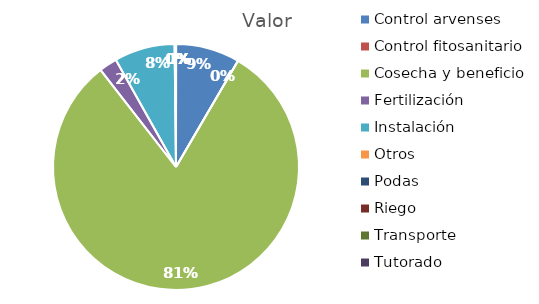
| Category | Valor |
|---|---|
| Control arvenses | 11300000 |
| Control fitosanitario | 0 |
| Cosecha y beneficio | 108960552 |
| Fertilización | 3200000 |
| Instalación | 10700000 |
| Otros | 250000 |
| Podas | 0 |
| Riego | 0 |
| Transporte | 0 |
| Tutorado | 0 |